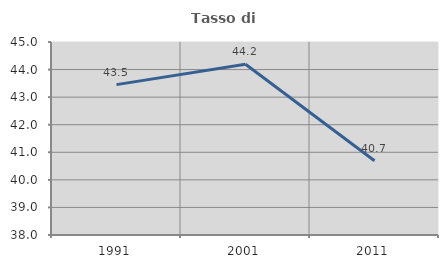
| Category | Tasso di occupazione   |
|---|---|
| 1991.0 | 43.453 |
| 2001.0 | 44.192 |
| 2011.0 | 40.693 |